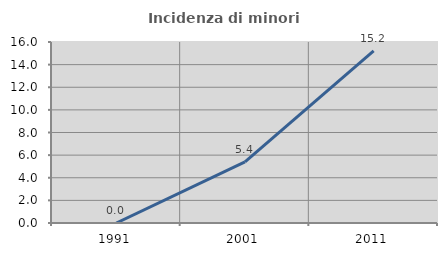
| Category | Incidenza di minori stranieri |
|---|---|
| 1991.0 | 0 |
| 2001.0 | 5.405 |
| 2011.0 | 15.217 |